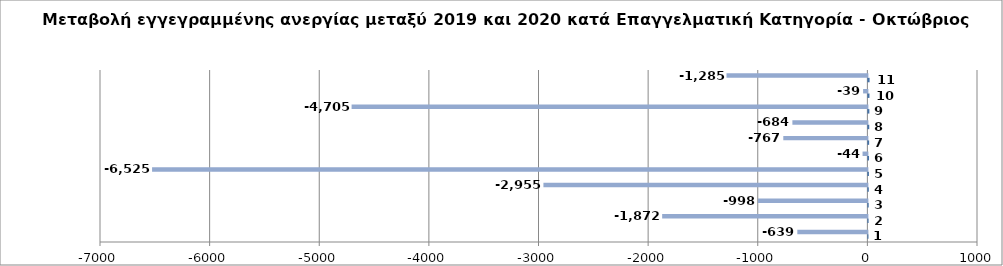
| Category | Series 0 | Series 1 |
|---|---|---|
| 0 | 1 | -639 |
| 1 | 2 | -1872 |
| 2 | 3 | -998 |
| 3 | 4 | -2955 |
| 4 | 5 | -6525 |
| 5 | 6 | -44 |
| 6 | 7 | -767 |
| 7 | 8 | -684 |
| 8 | 9 | -4705 |
| 9 | 10 | -39 |
| 10 | 11 | -1285 |